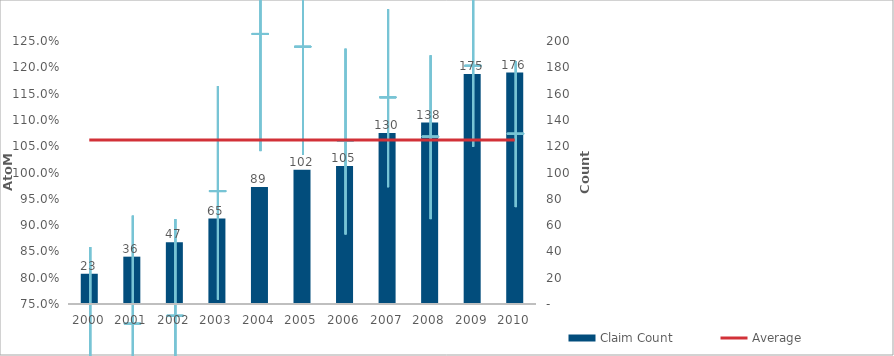
| Category | Claim Count |
|---|---|
| 0 | 23 |
| 1 | 36 |
| 2 | 47 |
| 3 | 65 |
| 4 | 89 |
| 5 | 102 |
| 6 | 105 |
| 7 | 130 |
| 8 | 138 |
| 9 | 175 |
| 10 | 176 |